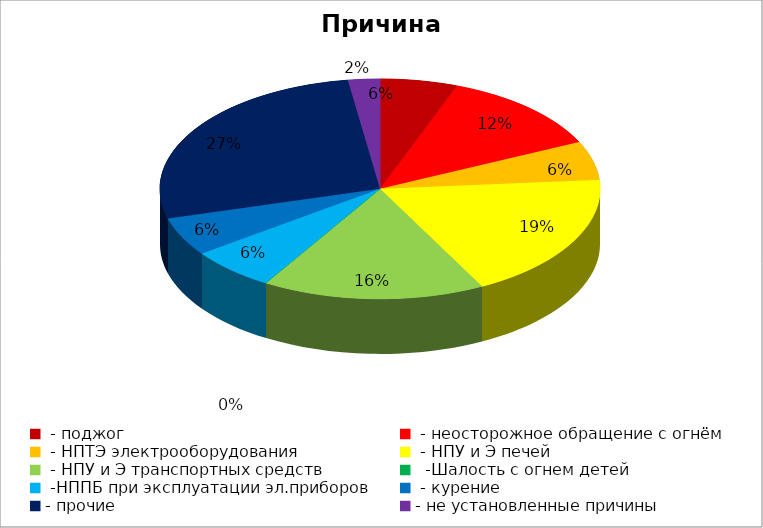
| Category | Причина пожара |
|---|---|
|  - поджог | 17 |
|  - неосторожное обращение с огнём | 37 |
|  - НПТЭ электрооборудования | 17 |
|  - НПУ и Э печей | 56 |
|  - НПУ и Э транспортных средств | 49 |
|   -Шалость с огнем детей | 0 |
|  -НППБ при эксплуатации эл.приборов | 19 |
|  - курение | 17 |
| - прочие | 81 |
| - не установленные причины | 7 |